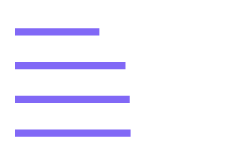
| Category | Series 0 |
|---|---|
| Customer #100 | 100485 |
| Customer #7 | 100101 |
| Customer #35 | 98230 |
| Customer #44 | 86723 |